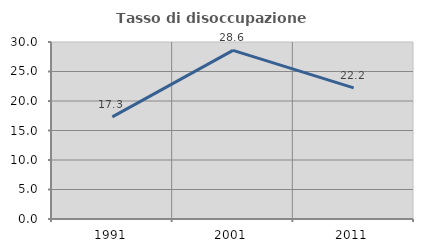
| Category | Tasso di disoccupazione giovanile  |
|---|---|
| 1991.0 | 17.308 |
| 2001.0 | 28.571 |
| 2011.0 | 22.222 |